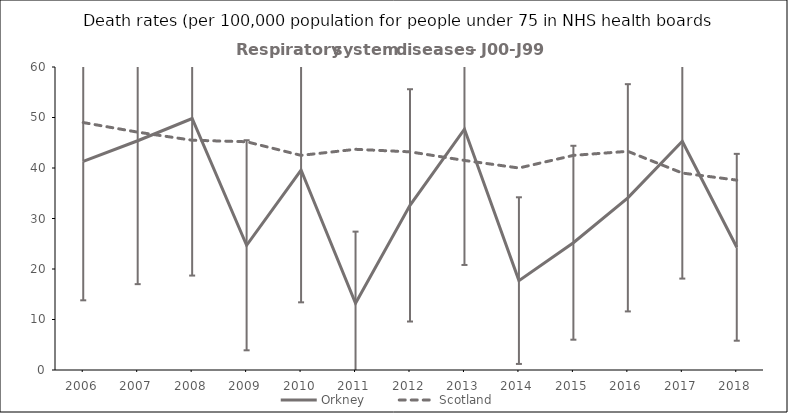
| Category | Orkney | Scotland |
|---|---|---|
| 2006.0 | 41.3 | 49 |
| 2007.0 | 45.4 | 47.1 |
| 2008.0 | 49.8 | 45.5 |
| 2009.0 | 24.7 | 45.2 |
| 2010.0 | 39.6 | 42.5 |
| 2011.0 | 13.2 | 43.7 |
| 2012.0 | 32.6 | 43.2 |
| 2013.0 | 47.7 | 41.5 |
| 2014.0 | 17.7 | 40 |
| 2015.0 | 25.2 | 42.5 |
| 2016.0 | 34.1 | 43.3 |
| 2017.0 | 45.3 | 39 |
| 2018.0 | 24.3 | 37.6 |